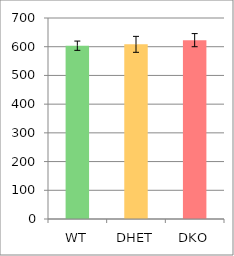
| Category | Series 0 |
|---|---|
| WT | 603.49 |
| DHET | 608.24 |
| DKO | 622.842 |